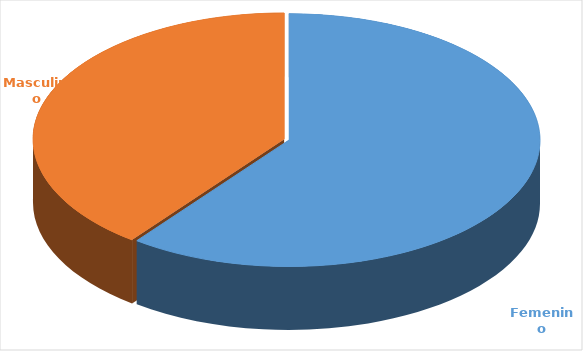
| Category | Cantidad  |
|---|---|
| Femenino | 3647 |
| Masculino | 2396 |